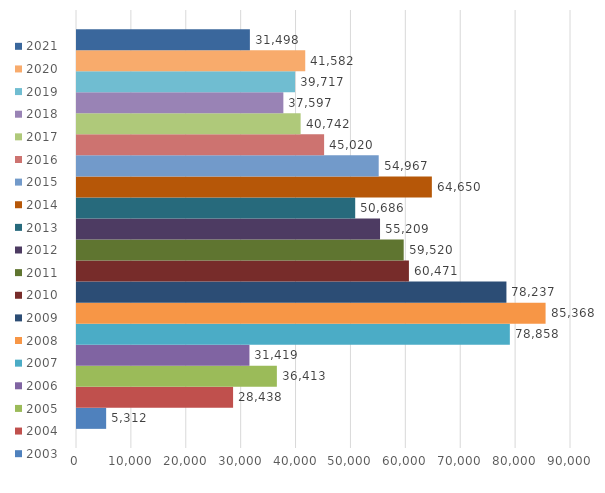
| Category | 2003 | 2004 | 2005 | 2006 | 2007 | 2008 | 2009 | 2010 | 2011 | 2012 | 2013 | 2014 | 2015 | 2016 | 2017 | 2018 | 2019 | 2020 | 2021 |
|---|---|---|---|---|---|---|---|---|---|---|---|---|---|---|---|---|---|---|---|
| 0 | 5312 | 28438 | 36413 | 31419 | 78858 | 85368 | 78237 | 60471 | 59520 | 55209 | 50686 | 64650 | 54967 | 45020 | 40742 | 37597 | 39717 | 41582 | 31498 |